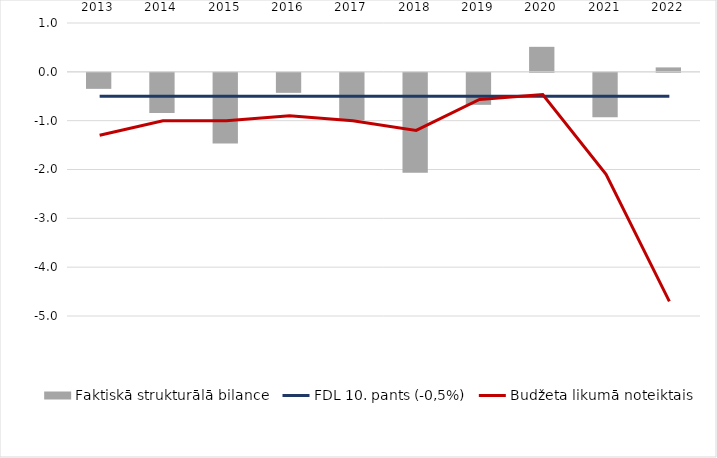
| Category | Faktiskā strukturālā bilance |
|---|---|
| 2013.0 | -0.328 |
| 2014.0 | -0.824 |
| 2015.0 | -1.447 |
| 2016.0 | -0.41 |
| 2017.0 | -0.971 |
| 2018.0 | -2.048 |
| 2019.0 | -0.655 |
| 2020.0 | 0.512 |
| 2021.0 | -0.909 |
| 2022.0 | 0.091 |